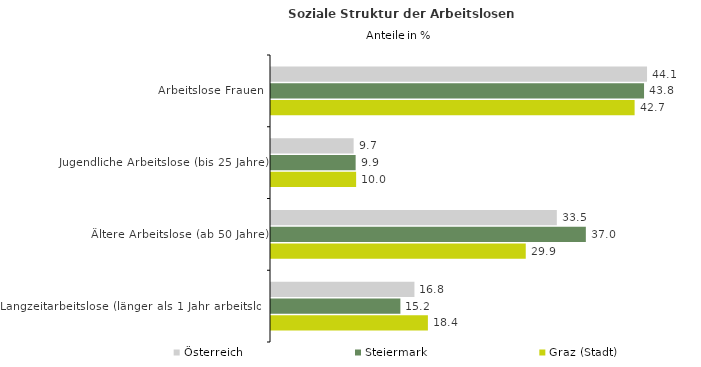
| Category | Österreich | Steiermark | Graz (Stadt) |
|---|---|---|---|
| Arbeitslose Frauen | 44.136 | 43.785 | 42.678 |
| Jugendliche Arbeitslose (bis 25 Jahre) | 9.698 | 9.935 | 9.991 |
| Ältere Arbeitslose (ab 50 Jahre) | 33.548 | 36.954 | 29.9 |
| Langzeitarbeitslose (länger als 1 Jahr arbeitslos) | 16.836 | 15.186 | 18.415 |